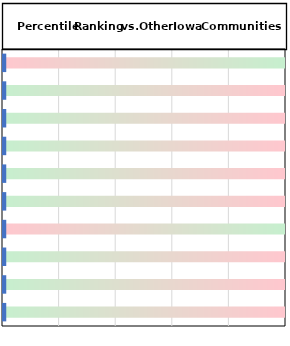
| Category | Spectrum |
|---|---|
| Median Household Income (MHI) | 10 |
| Percent Below Poverty Level | 10 |
| Percent Receiving Public Assistance or SNAP | 10 |
| Percent Receiving Supplemental Security Income | 10 |
| Unemployment Rate (Primary County 12 mo avg) | 10 |
| Percent Not in Labor Force | 10 |
| Population Trend (2010-2020) | 10 |
| Percent with High School Diploma or Less | 10 |
| Percent of Vacant Homes (excl. Seasonal and Vacation) | 10 |
| Percent Housing Cost Burdened (>= 30% of Income) | 10 |